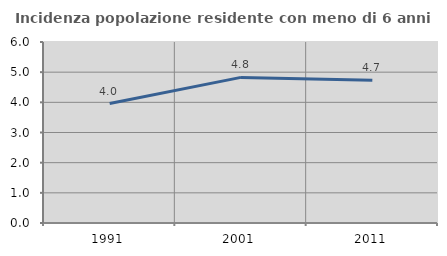
| Category | Incidenza popolazione residente con meno di 6 anni |
|---|---|
| 1991.0 | 3.959 |
| 2001.0 | 4.827 |
| 2011.0 | 4.735 |